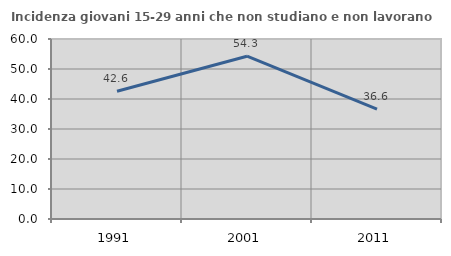
| Category | Incidenza giovani 15-29 anni che non studiano e non lavorano  |
|---|---|
| 1991.0 | 42.588 |
| 2001.0 | 54.255 |
| 2011.0 | 36.628 |